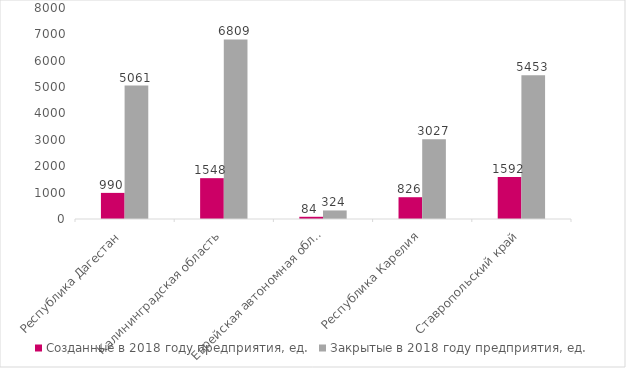
| Category | Созданные в 2018 году предприятия, ед. | Закрытые в 2018 году предприятия, ед. |
|---|---|---|
| Республика Дагестан | 990 | 5061 |
| Калининградская область | 1548 | 6809 |
| Еврейская автономная область | 84 | 324 |
| Республика Карелия | 826 | 3027 |
| Ставропольский край | 1592 | 5453 |